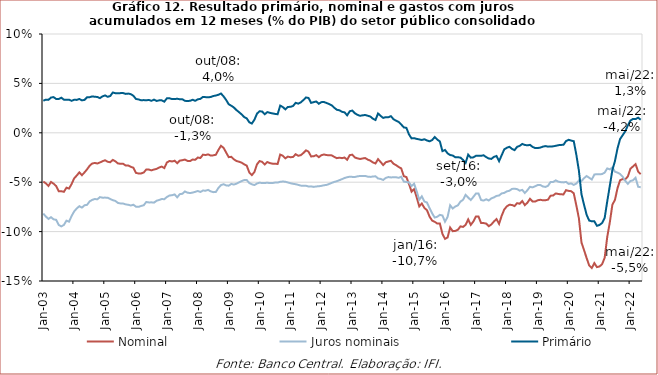
| Category | Nominal | Juros nominais | Primário |
|---|---|---|---|
| 2003-01-01 | -0.049 | -0.082 | 0.032 |
| 2003-02-01 | -0.051 | -0.085 | 0.034 |
| 2003-03-01 | -0.054 | -0.087 | 0.033 |
| 2003-04-01 | -0.05 | -0.085 | 0.036 |
| 2003-05-01 | -0.051 | -0.088 | 0.036 |
| 2003-06-01 | -0.054 | -0.088 | 0.034 |
| 2003-07-01 | -0.059 | -0.093 | 0.034 |
| 2003-08-01 | -0.059 | -0.095 | 0.036 |
| 2003-09-01 | -0.06 | -0.093 | 0.034 |
| 2003-10-01 | -0.056 | -0.089 | 0.033 |
| 2003-11-01 | -0.056 | -0.09 | 0.034 |
| 2003-12-01 | -0.052 | -0.084 | 0.032 |
| 2004-01-01 | -0.046 | -0.08 | 0.033 |
| 2004-02-01 | -0.043 | -0.077 | 0.033 |
| 2004-03-01 | -0.04 | -0.074 | 0.034 |
| 2004-04-01 | -0.043 | -0.076 | 0.033 |
| 2004-05-01 | -0.04 | -0.073 | 0.033 |
| 2004-06-01 | -0.037 | -0.073 | 0.036 |
| 2004-07-01 | -0.033 | -0.069 | 0.036 |
| 2004-08-01 | -0.031 | -0.068 | 0.037 |
| 2004-09-01 | -0.031 | -0.067 | 0.036 |
| 2004-10-01 | -0.031 | -0.067 | 0.036 |
| 2004-11-01 | -0.03 | -0.065 | 0.035 |
| 2004-12-01 | -0.029 | -0.066 | 0.037 |
| 2005-01-01 | -0.028 | -0.066 | 0.038 |
| 2005-02-01 | -0.029 | -0.066 | 0.036 |
| 2005-03-01 | -0.03 | -0.067 | 0.037 |
| 2005-04-01 | -0.027 | -0.068 | 0.041 |
| 2005-05-01 | -0.029 | -0.069 | 0.04 |
| 2005-06-01 | -0.031 | -0.071 | 0.04 |
| 2005-07-01 | -0.031 | -0.071 | 0.04 |
| 2005-08-01 | -0.031 | -0.072 | 0.04 |
| 2005-09-01 | -0.033 | -0.072 | 0.039 |
| 2005-10-01 | -0.033 | -0.073 | 0.04 |
| 2005-11-01 | -0.034 | -0.074 | 0.039 |
| 2005-12-01 | -0.035 | -0.073 | 0.037 |
| 2006-01-01 | -0.041 | -0.075 | 0.034 |
| 2006-02-01 | -0.041 | -0.075 | 0.034 |
| 2006-03-01 | -0.041 | -0.074 | 0.033 |
| 2006-04-01 | -0.04 | -0.073 | 0.033 |
| 2006-05-01 | -0.037 | -0.07 | 0.033 |
| 2006-06-01 | -0.037 | -0.07 | 0.033 |
| 2006-07-01 | -0.038 | -0.07 | 0.032 |
| 2006-08-01 | -0.037 | -0.071 | 0.034 |
| 2006-09-01 | -0.037 | -0.069 | 0.032 |
| 2006-10-01 | -0.035 | -0.068 | 0.033 |
| 2006-11-01 | -0.034 | -0.067 | 0.033 |
| 2006-12-01 | -0.036 | -0.067 | 0.032 |
| 2007-01-01 | -0.03 | -0.065 | 0.035 |
| 2007-02-01 | -0.028 | -0.063 | 0.035 |
| 2007-03-01 | -0.029 | -0.063 | 0.034 |
| 2007-04-01 | -0.028 | -0.062 | 0.034 |
| 2007-05-01 | -0.031 | -0.065 | 0.034 |
| 2007-06-01 | -0.028 | -0.062 | 0.034 |
| 2007-07-01 | -0.028 | -0.062 | 0.034 |
| 2007-08-01 | -0.027 | -0.059 | 0.032 |
| 2007-09-01 | -0.028 | -0.061 | 0.032 |
| 2007-10-01 | -0.029 | -0.061 | 0.032 |
| 2007-11-01 | -0.027 | -0.06 | 0.033 |
| 2007-12-01 | -0.027 | -0.06 | 0.032 |
| 2008-01-01 | -0.025 | -0.059 | 0.034 |
| 2008-02-01 | -0.026 | -0.06 | 0.034 |
| 2008-03-01 | -0.022 | -0.058 | 0.036 |
| 2008-04-01 | -0.022 | -0.059 | 0.036 |
| 2008-05-01 | -0.022 | -0.058 | 0.036 |
| 2008-06-01 | -0.023 | -0.059 | 0.036 |
| 2008-07-01 | -0.023 | -0.06 | 0.037 |
| 2008-08-01 | -0.022 | -0.06 | 0.038 |
| 2008-09-01 | -0.017 | -0.056 | 0.039 |
| 2008-10-01 | -0.013 | -0.053 | 0.04 |
| 2008-11-01 | -0.015 | -0.052 | 0.037 |
| 2008-12-01 | -0.02 | -0.053 | 0.033 |
| 2009-01-01 | -0.025 | -0.054 | 0.029 |
| 2009-02-01 | -0.024 | -0.052 | 0.027 |
| 2009-03-01 | -0.027 | -0.052 | 0.026 |
| 2009-04-01 | -0.029 | -0.052 | 0.023 |
| 2009-05-01 | -0.029 | -0.05 | 0.021 |
| 2009-06-01 | -0.03 | -0.049 | 0.019 |
| 2009-07-01 | -0.032 | -0.048 | 0.016 |
| 2009-08-01 | -0.033 | -0.048 | 0.015 |
| 2009-09-01 | -0.04 | -0.051 | 0.011 |
| 2009-10-01 | -0.043 | -0.052 | 0.009 |
| 2009-11-01 | -0.04 | -0.053 | 0.013 |
| 2009-12-01 | -0.032 | -0.051 | 0.019 |
| 2010-01-01 | -0.029 | -0.05 | 0.022 |
| 2010-02-01 | -0.029 | -0.051 | 0.022 |
| 2010-03-01 | -0.032 | -0.051 | 0.019 |
| 2010-04-01 | -0.03 | -0.051 | 0.021 |
| 2010-05-01 | -0.031 | -0.051 | 0.02 |
| 2010-06-01 | -0.031 | -0.051 | 0.02 |
| 2010-07-01 | -0.031 | -0.05 | 0.019 |
| 2010-08-01 | -0.032 | -0.05 | 0.019 |
| 2010-09-01 | -0.022 | -0.05 | 0.028 |
| 2010-10-01 | -0.023 | -0.049 | 0.026 |
| 2010-11-01 | -0.026 | -0.05 | 0.024 |
| 2010-12-01 | -0.024 | -0.05 | 0.026 |
| 2011-01-01 | -0.025 | -0.051 | 0.026 |
| 2011-02-01 | -0.024 | -0.052 | 0.027 |
| 2011-03-01 | -0.022 | -0.052 | 0.03 |
| 2011-04-01 | -0.023 | -0.053 | 0.029 |
| 2011-05-01 | -0.023 | -0.053 | 0.031 |
| 2011-06-01 | -0.02 | -0.054 | 0.033 |
| 2011-07-01 | -0.018 | -0.054 | 0.036 |
| 2011-08-01 | -0.019 | -0.054 | 0.035 |
| 2011-09-01 | -0.024 | -0.054 | 0.03 |
| 2011-10-01 | -0.024 | -0.055 | 0.031 |
| 2011-11-01 | -0.023 | -0.054 | 0.032 |
| 2011-12-01 | -0.025 | -0.054 | 0.029 |
| 2012-01-01 | -0.023 | -0.054 | 0.031 |
| 2012-02-01 | -0.022 | -0.053 | 0.031 |
| 2012-03-01 | -0.023 | -0.053 | 0.03 |
| 2012-04-01 | -0.023 | -0.052 | 0.029 |
| 2012-05-01 | -0.023 | -0.051 | 0.028 |
| 2012-06-01 | -0.024 | -0.05 | 0.025 |
| 2012-07-01 | -0.026 | -0.049 | 0.023 |
| 2012-08-01 | -0.025 | -0.048 | 0.023 |
| 2012-09-01 | -0.026 | -0.047 | 0.021 |
| 2012-10-01 | -0.025 | -0.046 | 0.021 |
| 2012-11-01 | -0.027 | -0.045 | 0.018 |
| 2012-12-01 | -0.023 | -0.044 | 0.022 |
| 2013-01-01 | -0.022 | -0.045 | 0.022 |
| 2013-02-01 | -0.025 | -0.045 | 0.02 |
| 2013-03-01 | -0.026 | -0.044 | 0.018 |
| 2013-04-01 | -0.026 | -0.044 | 0.017 |
| 2013-05-01 | -0.026 | -0.044 | 0.018 |
| 2013-06-01 | -0.026 | -0.044 | 0.018 |
| 2013-07-01 | -0.027 | -0.044 | 0.017 |
| 2013-08-01 | -0.028 | -0.045 | 0.016 |
| 2013-09-01 | -0.03 | -0.044 | 0.014 |
| 2013-10-01 | -0.031 | -0.044 | 0.013 |
| 2013-11-01 | -0.027 | -0.046 | 0.02 |
| 2013-12-01 | -0.03 | -0.047 | 0.017 |
| 2014-01-01 | -0.033 | -0.048 | 0.015 |
| 2014-02-01 | -0.03 | -0.046 | 0.016 |
| 2014-03-01 | -0.029 | -0.045 | 0.016 |
| 2014-04-01 | -0.028 | -0.045 | 0.017 |
| 2014-05-01 | -0.031 | -0.045 | 0.014 |
| 2014-06-01 | -0.033 | -0.045 | 0.012 |
| 2014-07-01 | -0.035 | -0.046 | 0.011 |
| 2014-08-01 | -0.036 | -0.044 | 0.008 |
| 2014-09-01 | -0.044 | -0.049 | 0.005 |
| 2014-10-01 | -0.045 | -0.05 | 0.005 |
| 2014-11-01 | -0.052 | -0.05 | -0.002 |
| 2014-12-01 | -0.06 | -0.054 | -0.006 |
| 2015-01-01 | -0.057 | -0.052 | -0.005 |
| 2015-02-01 | -0.065 | -0.059 | -0.006 |
| 2015-03-01 | -0.074 | -0.068 | -0.007 |
| 2015-04-01 | -0.072 | -0.064 | -0.007 |
| 2015-05-01 | -0.076 | -0.07 | -0.007 |
| 2015-06-01 | -0.078 | -0.071 | -0.008 |
| 2015-07-01 | -0.085 | -0.076 | -0.009 |
| 2015-08-01 | -0.089 | -0.081 | -0.007 |
| 2015-09-01 | -0.09 | -0.086 | -0.004 |
| 2015-10-01 | -0.092 | -0.085 | -0.007 |
| 2015-11-01 | -0.092 | -0.083 | -0.009 |
| 2015-12-01 | -0.102 | -0.084 | -0.019 |
| 2016-01-01 | -0.107 | -0.09 | -0.017 |
| 2016-02-01 | -0.106 | -0.085 | -0.021 |
| 2016-03-01 | -0.096 | -0.073 | -0.023 |
| 2016-04-01 | -0.1 | -0.077 | -0.023 |
| 2016-05-01 | -0.099 | -0.075 | -0.025 |
| 2016-06-01 | -0.098 | -0.073 | -0.025 |
| 2016-07-01 | -0.095 | -0.07 | -0.025 |
| 2016-08-01 | -0.095 | -0.068 | -0.027 |
| 2016-09-01 | -0.093 | -0.063 | -0.03 |
| 2016-10-01 | -0.088 | -0.066 | -0.022 |
| 2016-11-01 | -0.093 | -0.068 | -0.025 |
| 2016-12-01 | -0.09 | -0.065 | -0.025 |
| 2017-01-01 | -0.085 | -0.061 | -0.023 |
| 2017-02-01 | -0.085 | -0.061 | -0.023 |
| 2017-03-01 | -0.091 | -0.068 | -0.023 |
| 2017-04-01 | -0.091 | -0.069 | -0.023 |
| 2017-05-01 | -0.092 | -0.067 | -0.025 |
| 2017-06-01 | -0.095 | -0.069 | -0.026 |
| 2017-07-01 | -0.093 | -0.066 | -0.026 |
| 2017-08-01 | -0.09 | -0.065 | -0.024 |
| 2017-09-01 | -0.087 | -0.064 | -0.023 |
| 2017-10-01 | -0.092 | -0.063 | -0.029 |
| 2017-11-01 | -0.084 | -0.061 | -0.023 |
| 2017-12-01 | -0.078 | -0.061 | -0.017 |
| 2018-01-01 | -0.074 | -0.059 | -0.015 |
| 2018-02-01 | -0.073 | -0.059 | -0.014 |
| 2018-03-01 | -0.073 | -0.057 | -0.016 |
| 2018-04-01 | -0.074 | -0.057 | -0.018 |
| 2018-05-01 | -0.071 | -0.057 | -0.014 |
| 2018-06-01 | -0.072 | -0.059 | -0.013 |
| 2018-07-01 | -0.069 | -0.058 | -0.011 |
| 2018-08-01 | -0.073 | -0.061 | -0.012 |
| 2018-09-01 | -0.071 | -0.058 | -0.013 |
| 2018-10-01 | -0.067 | -0.055 | -0.012 |
| 2018-11-01 | -0.069 | -0.055 | -0.014 |
| 2018-12-01 | -0.07 | -0.054 | -0.015 |
| 2019-01-01 | -0.068 | -0.053 | -0.015 |
| 2019-02-01 | -0.068 | -0.053 | -0.015 |
| 2019-03-01 | -0.068 | -0.054 | -0.014 |
| 2019-04-01 | -0.068 | -0.055 | -0.013 |
| 2019-05-01 | -0.068 | -0.054 | -0.014 |
| 2019-06-01 | -0.064 | -0.05 | -0.014 |
| 2019-07-01 | -0.063 | -0.05 | -0.014 |
| 2019-08-01 | -0.061 | -0.048 | -0.013 |
| 2019-09-01 | -0.062 | -0.049 | -0.013 |
| 2019-10-01 | -0.062 | -0.05 | -0.012 |
| 2019-11-01 | -0.062 | -0.05 | -0.012 |
| 2019-12-01 | -0.058 | -0.05 | -0.008 |
| 2020-01-01 | -0.059 | -0.052 | -0.007 |
| 2020-02-01 | -0.059 | -0.051 | -0.008 |
| 2020-03-01 | -0.061 | -0.053 | -0.008 |
| 2020-04-01 | -0.074 | -0.051 | -0.022 |
| 2020-05-01 | -0.087 | -0.048 | -0.038 |
| 2020-06-01 | -0.111 | -0.049 | -0.062 |
| 2020-07-01 | -0.119 | -0.046 | -0.073 |
| 2020-08-01 | -0.127 | -0.044 | -0.083 |
| 2020-09-01 | -0.134 | -0.046 | -0.089 |
| 2020-10-01 | -0.137 | -0.047 | -0.09 |
| 2020-11-01 | -0.132 | -0.042 | -0.09 |
| 2020-12-01 | -0.136 | -0.042 | -0.094 |
| 2021-01-01 | -0.135 | -0.042 | -0.093 |
| 2021-02-01 | -0.133 | -0.042 | -0.091 |
| 2021-03-01 | -0.127 | -0.04 | -0.086 |
| 2021-04-01 | -0.105 | -0.036 | -0.069 |
| 2021-05-01 | -0.091 | -0.037 | -0.054 |
| 2021-06-01 | -0.073 | -0.035 | -0.038 |
| 2021-07-01 | -0.068 | -0.039 | -0.029 |
| 2021-08-01 | -0.056 | -0.04 | -0.016 |
| 2021-09-01 | -0.048 | -0.042 | -0.006 |
| 2021-10-01 | -0.047 | -0.044 | -0.002 |
| 2021-11-01 | -0.047 | -0.049 | 0.001 |
| 2021-12-01 | -0.044 | -0.052 | 0.007 |
| 2022-01-01 | -0.036 | -0.049 | 0.012 |
| 2022-02-01 | -0.034 | -0.048 | 0.014 |
| 2022-03-01 | -0.032 | -0.046 | 0.014 |
| 2022-04-01 | -0.039 | -0.055 | 0.015 |
| 2022-05-01 | -0.042 | -0.055 | 0.013 |